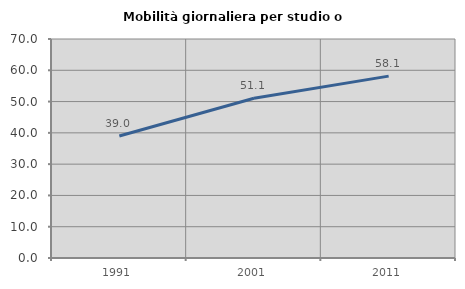
| Category | Mobilità giornaliera per studio o lavoro |
|---|---|
| 1991.0 | 38.986 |
| 2001.0 | 51.083 |
| 2011.0 | 58.128 |